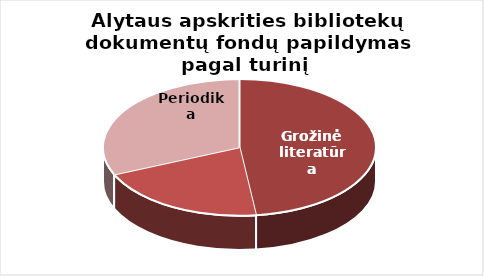
| Category | Series 0 |
|---|---|
| Grožinė literatūra | 22845 |
| Šakinė literatūra | 9721 |
| Periodika | 14960 |